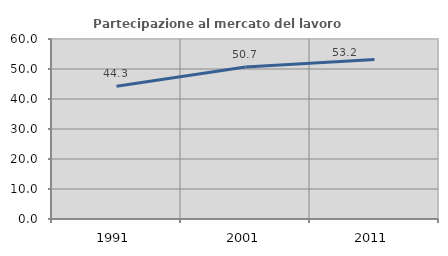
| Category | Partecipazione al mercato del lavoro  femminile |
|---|---|
| 1991.0 | 44.255 |
| 2001.0 | 50.694 |
| 2011.0 | 53.193 |